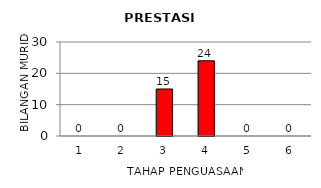
| Category | Series 0 |
|---|---|
| 1.0 | 0 |
| 2.0 | 0 |
| 3.0 | 15 |
| 4.0 | 24 |
| 5.0 | 0 |
| 6.0 | 0 |